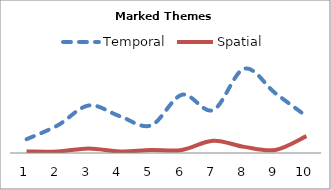
| Category | Temporal | Spatial |
|---|---|---|
| 0 | 9 | 1 |
| 1 | 18 | 1 |
| 2 | 31 | 3 |
| 3 | 24 | 1 |
| 4 | 18 | 2 |
| 5 | 38 | 2 |
| 6 | 28 | 8 |
| 7 | 55 | 4 |
| 8 | 39 | 2 |
| 9 | 24 | 11 |